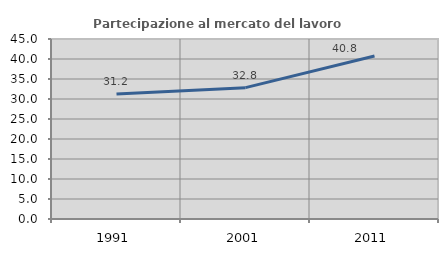
| Category | Partecipazione al mercato del lavoro  femminile |
|---|---|
| 1991.0 | 31.228 |
| 2001.0 | 32.836 |
| 2011.0 | 40.751 |